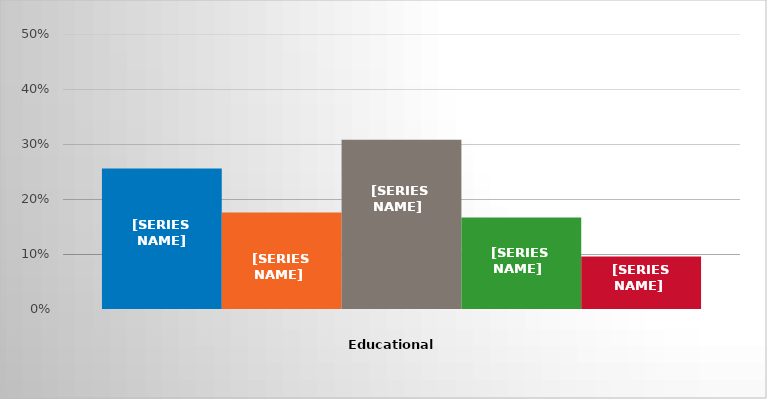
| Category | GED/High school diploma | Less than 1 year of college | 1 year of college | 2 years of college | Other |
|---|---|---|---|---|---|
| 0 | 0.255 | 0.175 | 0.308 | 0.166 | 0.095 |